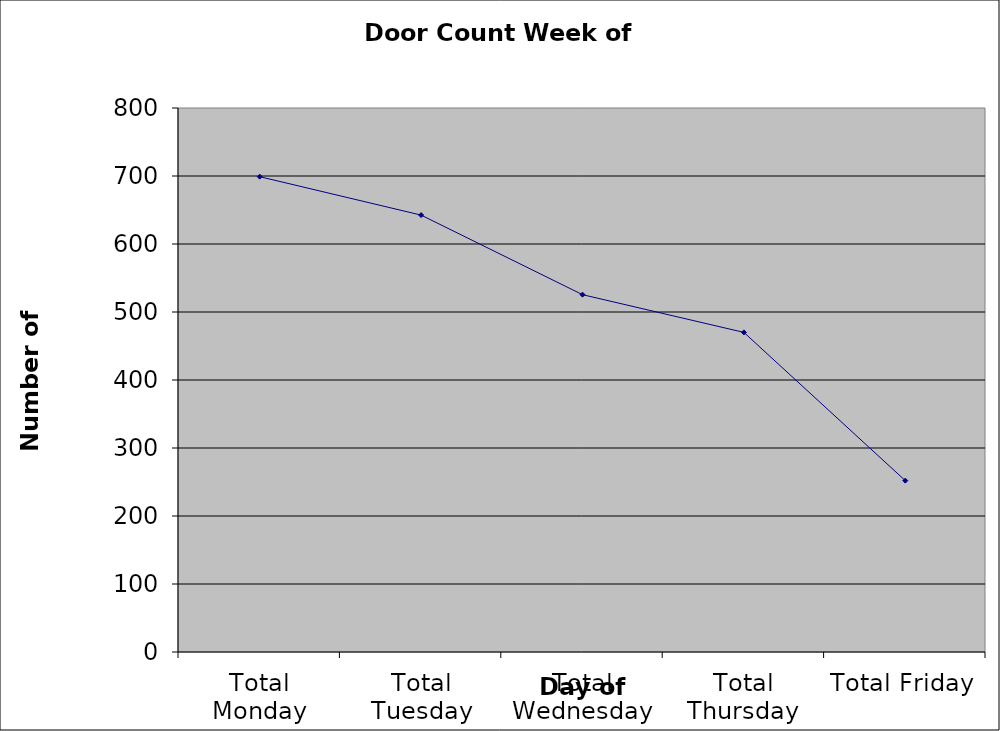
| Category | Series 0 |
|---|---|
| Total Monday | 699 |
| Total Tuesday | 642.5 |
| Total Wednesday | 525.5 |
| Total Thursday | 470 |
| Total Friday | 252 |